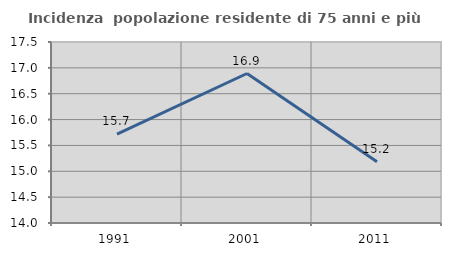
| Category | Incidenza  popolazione residente di 75 anni e più |
|---|---|
| 1991.0 | 15.717 |
| 2001.0 | 16.891 |
| 2011.0 | 15.182 |